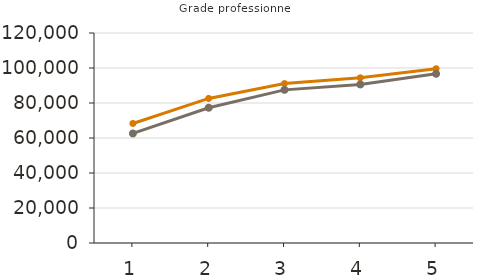
| Category | Moyens | Médians |
|---|---|---|
| 1.0 | 68300 | 62600 |
| 2.0 | 82600 | 77300 |
| 3.0 | 91100 | 87500 |
| 4.0 | 94400 | 90600 |
| 5.0 | 99600 | 96700 |